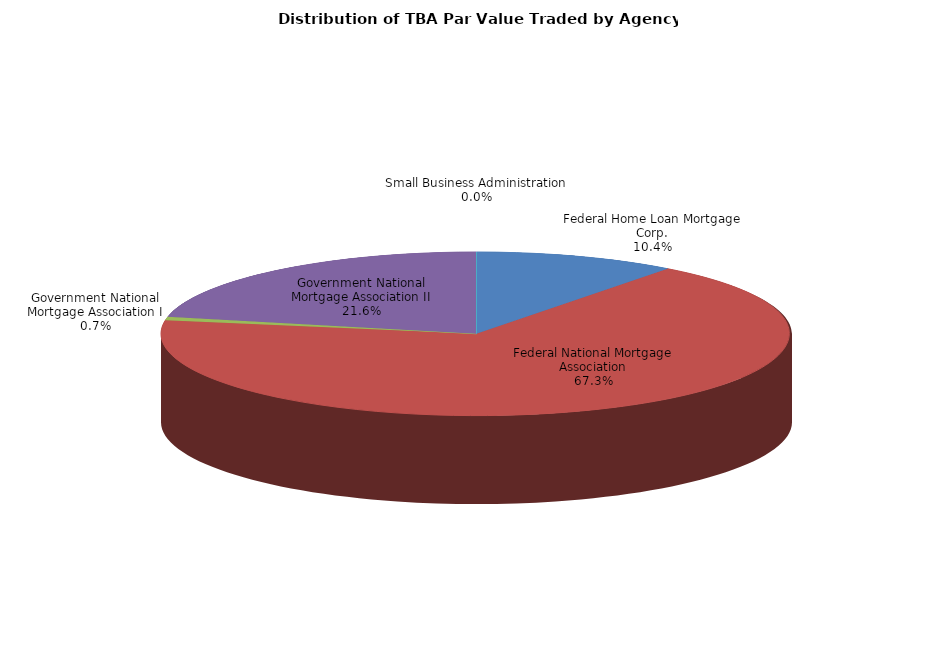
| Category | Series 0 |
|---|---|
| Federal Home Loan Mortgage Corp. | 20074349513.571 |
| Federal National Mortgage Association | 130389285955.041 |
| Government National Mortgage Association I | 1333944644.461 |
| Government National Mortgage Association II | 41945253733.449 |
| Small Business Administration | 0 |